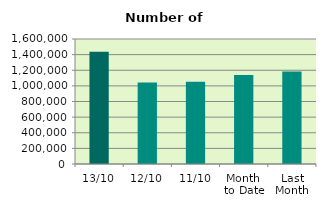
| Category | Series 0 |
|---|---|
| 13/10 | 1437912 |
| 12/10 | 1043224 |
| 11/10 | 1053792 |
| Month 
to Date | 1139124 |
| Last
Month | 1182612.273 |